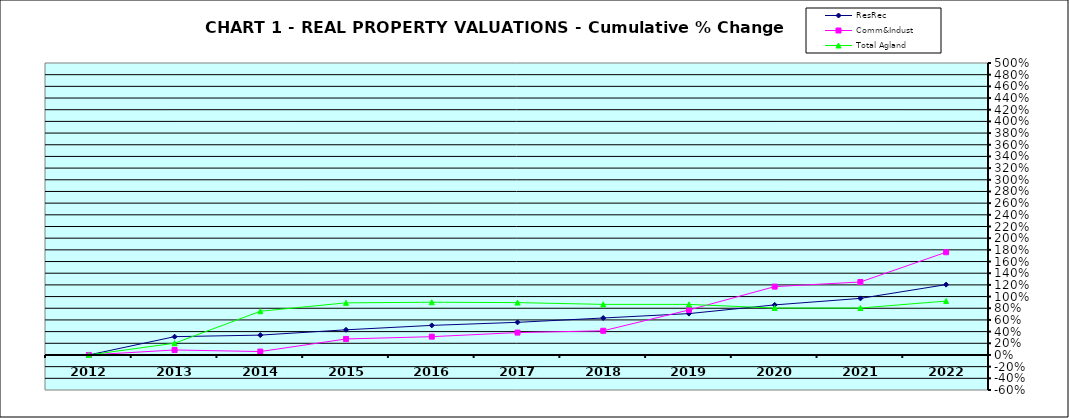
| Category | ResRec | Comm&Indust | Total Agland |
|---|---|---|---|
| 2012.0 | 0 | 0 | 0 |
| 2013.0 | 0.313 | 0.085 | 0.201 |
| 2014.0 | 0.34 | 0.058 | 0.749 |
| 2015.0 | 0.431 | 0.274 | 0.893 |
| 2016.0 | 0.507 | 0.313 | 0.903 |
| 2017.0 | 0.559 | 0.383 | 0.897 |
| 2018.0 | 0.633 | 0.414 | 0.866 |
| 2019.0 | 0.708 | 0.771 | 0.866 |
| 2020.0 | 0.857 | 1.17 | 0.804 |
| 2021.0 | 0.969 | 1.25 | 0.804 |
| 2022.0 | 1.205 | 1.76 | 0.923 |